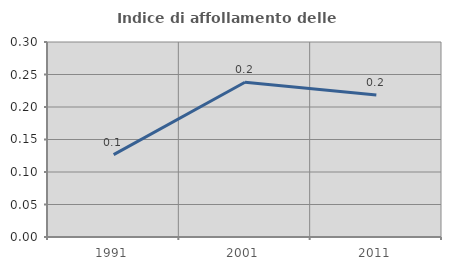
| Category | Indice di affollamento delle abitazioni  |
|---|---|
| 1991.0 | 0.127 |
| 2001.0 | 0.238 |
| 2011.0 | 0.218 |